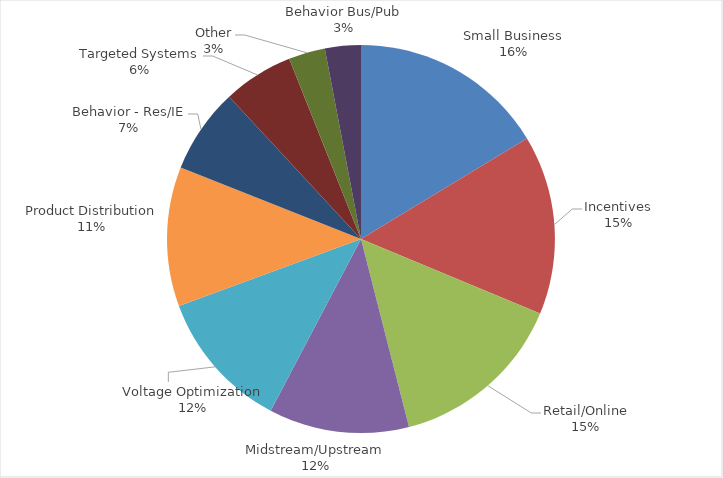
| Category | Series 0 |
|---|---|
| Small Business | 251591666 |
| Incentives | 230272621 |
| Retail/Online | 227020791 |
| Midstream/Upstream | 180047539 |
| Voltage Optimization | 179982384 |
| Product Distribution | 179037503 |
| Behavior - Res/IE | 109384787 |
| Targeted Systems | 90144532.1 |
| Other | 46895939.2 |
| Behavior Bus/Pub | 46044130.6 |